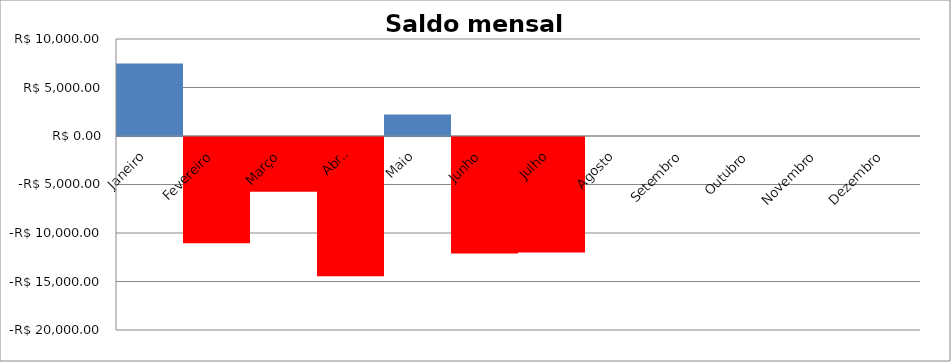
| Category | Series 44 |
|---|---|
| Janeiro | 7476 |
| Fevereiro | -10946 |
| Março | -5641 |
| Abril | -14361 |
| Maio | 2205 |
| Junho | -12013 |
| Julho | -11917 |
| Agosto | 0 |
| Setembro | 0 |
| Outubro | 0 |
| Novembro | 0 |
| Dezembro | 0 |